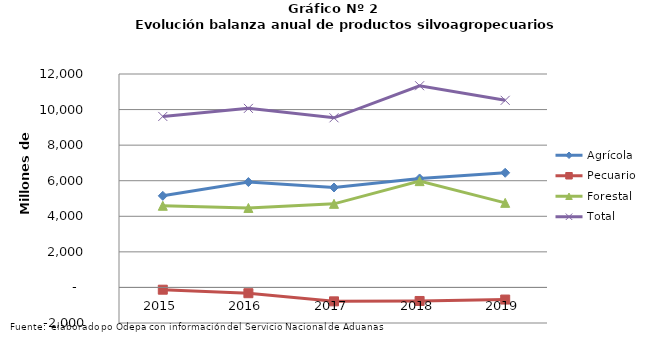
| Category | Agrícola | Pecuario | Forestal | Total |
|---|---|---|---|---|
| 2015.0 | 5149872 | -127785 | 4591408 | 9613495 |
| 2016.0 | 5924661 | -325421 | 4468104 | 10067344 |
| 2017.0 | 5619304 | -782654 | 4700192 | 9536842 |
| 2018.0 | 6126434 | -761998 | 5976134 | 11340570 |
| 2019.0 | 6446239 | -681606 | 4755358 | 10519991 |